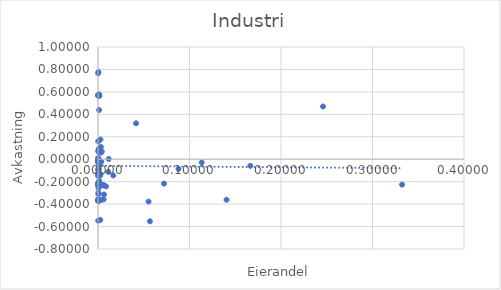
| Category | alpha |
|---|---|
| 0.00023115298681709233 | -0.026 |
| 0.0012 | 0.059 |
| 0.0008 | -0.359 |
| 0.00021945210655072655 | -0.012 |
| 0.0015813784762450012 | -0.011 |
| 0.0 | -0.23 |
| 0.005172048625014135 | -0.23 |
| 0.0008861980235444139 | -0.02 |
| 0.1665303857666496 | -0.058 |
| 0.0004 | 0.16 |
| 0.0013 | -0.193 |
| 0.0010223319461726752 | -0.225 |
| 0.0008191903449479407 | 0.089 |
| 0.00013728016980114066 | -0.224 |
| 0.0112 | -0.113 |
| 0.00020851698518656965 | -0.025 |
| 0.0018278201209073978 | -0.222 |
| 0.0006695918020169416 | -0.02 |
| 0.33227900073781924 | -0.227 |
| 0.0001265607998158437 | -0.229 |
| 0.0005 | -0.369 |
| 0.0006018495806229883 | 0.07 |
| 0.0018794269012865049 | -0.147 |
| 0.011774773002243258 | 0.002 |
| 0.00628696670859278 | -0.229 |
| 0.0001980452650267387 | 0.573 |
| 0.0007799970978285392 | -0.086 |
| 0.00016414944962567013 | -0.366 |
| 0.0021391691434422756 | -0.032 |
| 0.0011680213442347104 | 0.571 |
| 0.0004842428578682265 | 0.161 |
| 0.0011154443757192289 | -0.228 |
| 0.002806774055238904 | -0.133 |
| 0.0031 | 0.109 |
| 0.0016 | 0.101 |
| 0.0007 | -0.37 |
| 0.0037123537913334543 | -0.363 |
| 0.0006672693960784447 | -0.256 |
| 0.0007149598565675485 | -0.021 |
| 0.14047338571960066 | -0.361 |
| 0.0087 | -0.242 |
| 0.07220604932238771 | -0.217 |
| 0.24588935695115402 | 0.47 |
| 0.003467043595915613 | 0.06 |
| 0.0018903057531208395 | -0.235 |
| 0.0035785120476896914 | -0.024 |
| 0.000699357659883844 | -0.011 |
| 0.0061503534018977875 | -0.358 |
| 0.005258083669203507 | -0.233 |
| 0.0014317608837763843 | 0.564 |
| 0.0006774924185142361 | -0.08 |
| 0.00410818701756315 | 0.069 |
| 0.0024 | -0.541 |
| 0.0002595313500263658 | -0.374 |
| 0.0002150097562035386 | -0.365 |
| 0.00012615069855855925 | -0.019 |
| 0.0018477978961699518 | -0.224 |
| 0.0013458433491862706 | -0.132 |
| 0.00046785156207055235 | -0.02 |
| 0.0005476785940811693 | 0.077 |
| 0.0013356570894122175 | -0.13 |
| 0.00042150122363745525 | -0.21 |
| 0.00025064852215895194 | -0.123 |
| 0.0022303495682828777 | -0.144 |
| 0.0009988300305536235 | -0.021 |
| 0.00165893698442908 | -0.032 |
| 0.0005247466455924037 | 0.07 |
| 0.00040691446519699115 | -0.128 |
| 0.0003990322715591934 | -0.016 |
| 0.0004880685234893642 | -0.221 |
| 0.00015238989812994718 | -0.355 |
| 0.00041008365977458837 | -0.143 |
| 0.0027 | 0.176 |
| 0.055245692699294024 | -0.377 |
| 0.0011458478338760992 | 0.575 |
| 0.0010843163189620288 | -0.134 |
| 0.0001523884416425563 | -0.019 |
| 0.0002259066787112356 | -0.15 |
| 0.0004942704226655578 | -0.133 |
| 0.0006428551134384107 | -0.019 |
| 0.0009999908251586977 | -0.139 |
| 0.016696945936160466 | -0.145 |
| 0.0005084635570901136 | 0.565 |
| 0.00072015186675707 | 0.576 |
| 0.08801167522340708 | -0.087 |
| 0.00027844682435660583 | 0.008 |
| 0.00025298676391990115 | -0.096 |
| 0.000840726804417122 | -0.025 |
| 0.0011553190869533444 | -0.002 |
| 0.0022431693858321992 | -0.011 |
| 0.0008390870070072087 | -0.232 |
| 0.0004443807727332833 | -0.228 |
| 0.0009427044041259418 | -0.227 |
| 0.0010006183918867902 | 0.073 |
| 0.0003374569664220461 | -0.208 |
| 0.00016642098091662047 | 0.01 |
| 0.11331668565997388 | -0.029 |
| 0.00020837098023288898 | -0.228 |
| 0.00034641073943863295 | -0.094 |
| 0.00011097748891312593 | 0.567 |
| 0.0002243079874956221 | -0.548 |
| 0.006512622934518222 | -0.314 |
| 0.001186020139019977 | 0.438 |
| 0.0005152007740349949 | -0.297 |
| 0.00016696260084055116 | 0.766 |
| 3.027877476889338e-05 | -0.231 |
| 0.05675197311235473 | -0.553 |
| 0.00041008365977458837 | 0.777 |
| 0.001434 | 0.074 |
| 0.0003609831443199048 | -0.312 |
| 0.0003489786288085406 | -0.023 |
| 0.041641115984213266 | 0.32 |
| 0.0008499078682596311 | -0.049 |